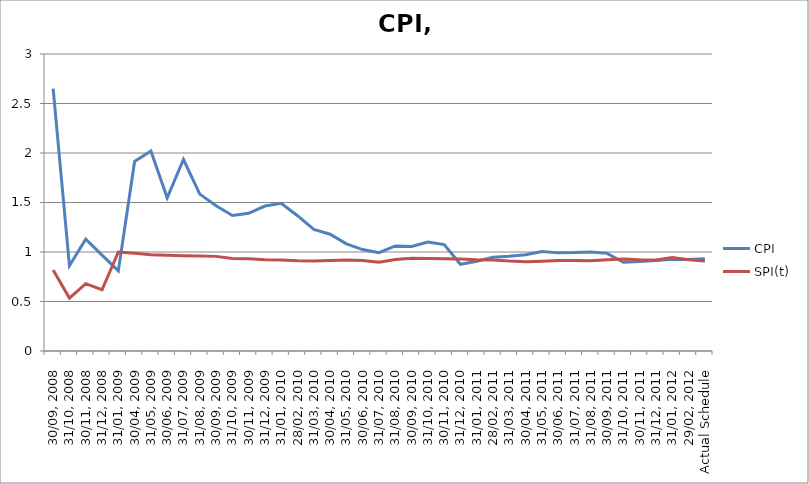
| Category | CPI | SPI(t) |
|---|---|---|
| 30/09, 2008 | 2.65 | 0.818 |
| 31/10, 2008 | 0.862 | 0.535 |
| 30/11, 2008 | 1.13 | 0.681 |
| 31/12, 2008 | 0.968 | 0.619 |
| 31/01, 2009 | 0.809 | 1 |
| 30/04, 2009 | 1.915 | 0.987 |
| 31/05, 2009 | 2.02 | 0.973 |
| 30/06, 2009 | 1.547 | 0.967 |
| 31/07, 2009 | 1.934 | 0.962 |
| 31/08, 2009 | 1.585 | 0.959 |
| 30/09, 2009 | 1.467 | 0.956 |
| 31/10, 2009 | 1.369 | 0.934 |
| 30/11, 2009 | 1.39 | 0.932 |
| 31/12, 2009 | 1.464 | 0.922 |
| 31/01, 2010 | 1.493 | 0.918 |
| 28/02, 2010 | 1.367 | 0.911 |
| 31/03, 2010 | 1.227 | 0.908 |
| 30/04, 2010 | 1.179 | 0.913 |
| 31/05, 2010 | 1.082 | 0.92 |
| 30/06, 2010 | 1.025 | 0.914 |
| 31/07, 2010 | 0.994 | 0.896 |
| 31/08, 2010 | 1.061 | 0.923 |
| 30/09, 2010 | 1.056 | 0.937 |
| 31/10, 2010 | 1.101 | 0.935 |
| 30/11, 2010 | 1.074 | 0.931 |
| 31/12, 2010 | 0.876 | 0.929 |
| 31/01, 2011 | 0.906 | 0.921 |
| 28/02, 2011 | 0.947 | 0.919 |
| 31/03, 2011 | 0.956 | 0.908 |
| 30/04, 2011 | 0.972 | 0.902 |
| 31/05, 2011 | 1.005 | 0.907 |
| 30/06, 2011 | 0.991 | 0.914 |
| 31/07, 2011 | 0.994 | 0.913 |
| 31/08, 2011 | 1.001 | 0.911 |
| 30/09, 2011 | 0.986 | 0.921 |
| 31/10, 2011 | 0.896 | 0.93 |
| 30/11, 2011 | 0.905 | 0.922 |
| 31/12, 2011 | 0.915 | 0.919 |
| 31/01, 2012 | 0.926 | 0.943 |
| 29/02, 2012 | 0.925 | 0.922 |
| Actual Schedule | 0.931 | 0.909 |